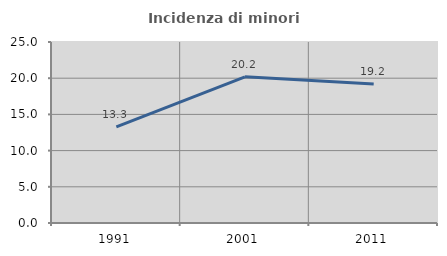
| Category | Incidenza di minori stranieri |
|---|---|
| 1991.0 | 13.265 |
| 2001.0 | 20.187 |
| 2011.0 | 19.196 |